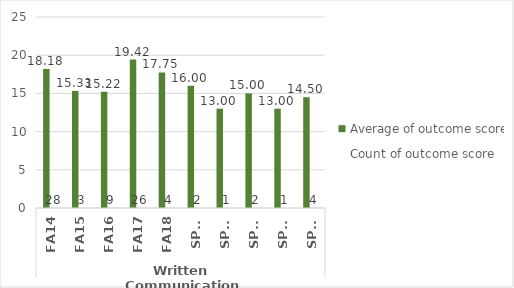
| Category | PTA.AAS - Average of outcome score | PTA.AAS - Count of outcome score |
|---|---|---|
| 0 | 18.179 | 28 |
| 1 | 15.333 | 3 |
| 2 | 15.222 | 9 |
| 3 | 19.423 | 26 |
| 4 | 17.75 | 4 |
| 5 | 16 | 2 |
| 6 | 13 | 1 |
| 7 | 15 | 2 |
| 8 | 13 | 1 |
| 9 | 14.5 | 4 |